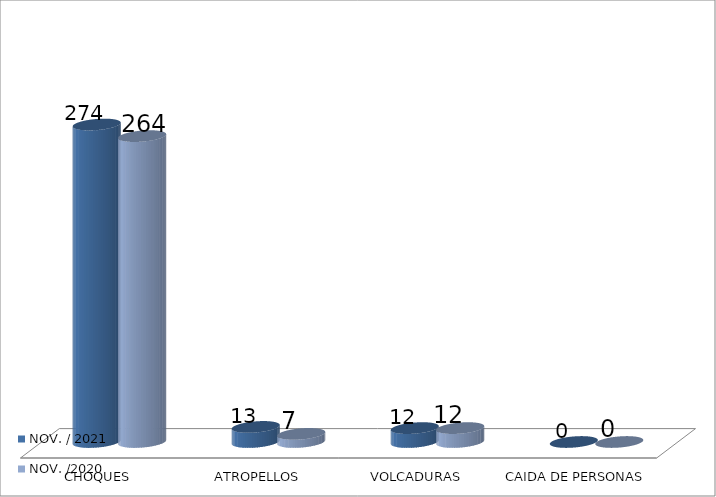
| Category | NOV. / 2021 | NOV. /2020 |
|---|---|---|
| CHOQUES | 274 | 264 |
| ATROPELLOS | 13 | 7 |
| VOLCADURAS | 12 | 12 |
| CAIDA DE PERSONAS | 0 | 0 |